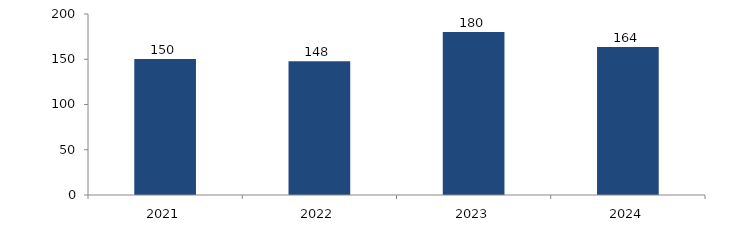
| Category | Bogotá |
|---|---|
| 2021.0 | 150.303 |
| 2022.0 | 147.789 |
| 2023.0 | 180.004 |
| 2024.0 | 163.664 |